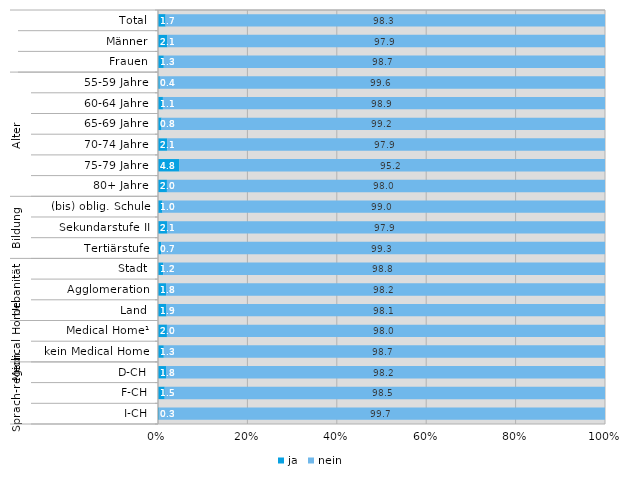
| Category | ja | nein |
|---|---|---|
| 0 | 1.7 | 98.3 |
| 1 | 2.1 | 97.9 |
| 2 | 1.3 | 98.7 |
| 3 | 0.4 | 99.6 |
| 4 | 1.1 | 98.9 |
| 5 | 0.8 | 99.2 |
| 6 | 2.1 | 97.9 |
| 7 | 4.8 | 95.2 |
| 8 | 2 | 98 |
| 9 | 1 | 99 |
| 10 | 2.1 | 97.9 |
| 11 | 0.7 | 99.3 |
| 12 | 1.2 | 98.8 |
| 13 | 1.8 | 98.2 |
| 14 | 1.9 | 98.1 |
| 15 | 2 | 98 |
| 16 | 1.3 | 98.7 |
| 17 | 1.8 | 98.2 |
| 18 | 1.5 | 98.5 |
| 19 | 0.3 | 99.7 |